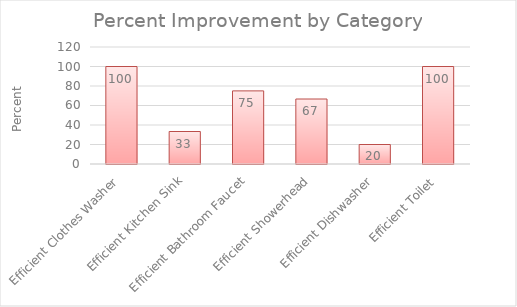
| Category | Series 0 |
|---|---|
| Efficient Clothes Washer | 100 |
| Efficient Kitchen Sink | 33.333 |
| Efficient Bathroom Faucet | 75 |
| Efficient Showerhead | 66.667 |
| Efficient Dishwasher | 20 |
| Efficient Toilet | 100 |